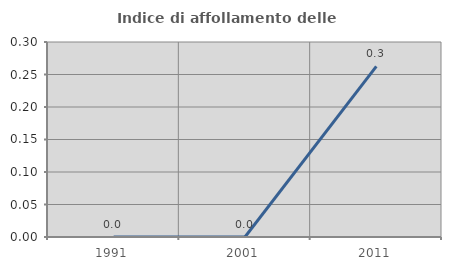
| Category | Indice di affollamento delle abitazioni  |
|---|---|
| 1991.0 | 0 |
| 2001.0 | 0 |
| 2011.0 | 0.262 |